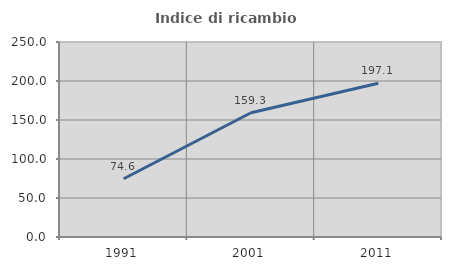
| Category | Indice di ricambio occupazionale  |
|---|---|
| 1991.0 | 74.636 |
| 2001.0 | 159.259 |
| 2011.0 | 197.071 |